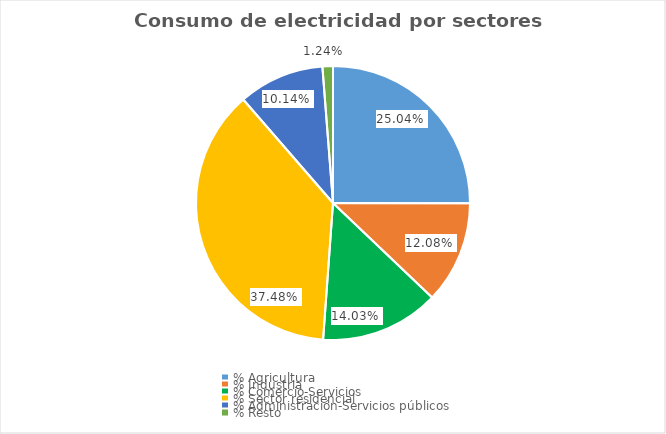
| Category | Series 0 |
|---|---|
| % Agricultura | 0.25 |
| % Industria | 0.121 |
| % Comercio-Servicios | 0.14 |
| % Sector residencial | 0.375 |
| % Administración-Servicios públicos | 0.101 |
| % Resto | 0.012 |